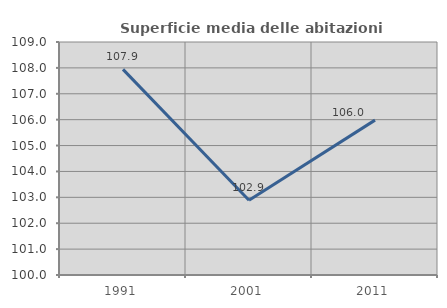
| Category | Superficie media delle abitazioni occupate |
|---|---|
| 1991.0 | 107.943 |
| 2001.0 | 102.886 |
| 2011.0 | 105.982 |